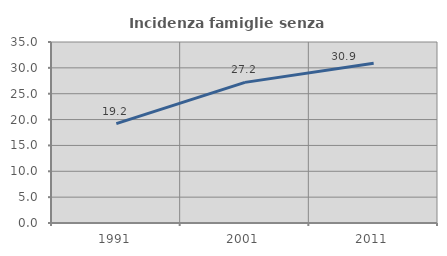
| Category | Incidenza famiglie senza nuclei |
|---|---|
| 1991.0 | 19.227 |
| 2001.0 | 27.195 |
| 2011.0 | 30.882 |